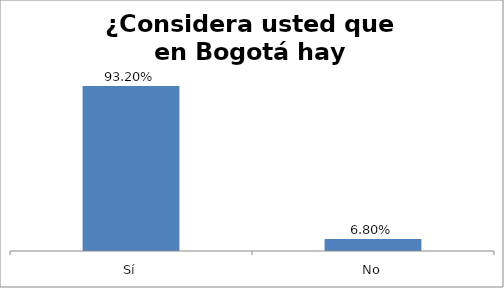
| Category | Total |
|---|---|
| Sí | 0.932 |
| No | 0.068 |